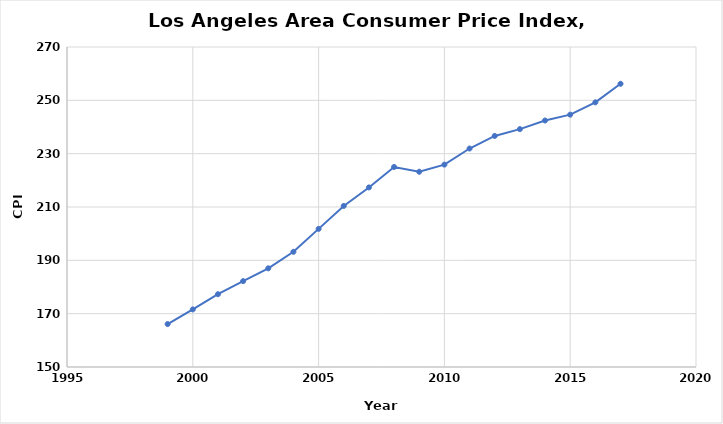
| Category | Series 0 |
|---|---|
| 2017.0 | 256.21 |
| 2016.0 | 249.246 |
| 2015.0 | 244.632 |
| 2014.0 | 242.434 |
| 2013.0 | 239.207 |
| 2012.0 | 236.648 |
| 2011.0 | 231.928 |
| 2010.0 | 225.894 |
| 2009.0 | 223.219 |
| 2008.0 | 225.008 |
| 2007.0 | 217.338 |
| 2006.0 | 210.4 |
| 2005.0 | 201.8 |
| 2004.0 | 193.2 |
| 2003.0 | 187 |
| 2002.0 | 182.2 |
| 2001.0 | 177.3 |
| 2000.0 | 171.6 |
| 1999.0 | 166.1 |